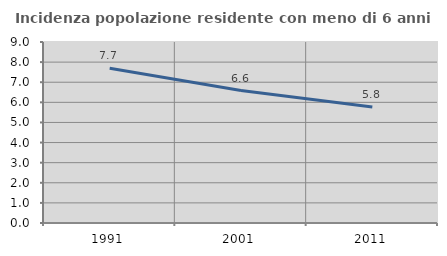
| Category | Incidenza popolazione residente con meno di 6 anni |
|---|---|
| 1991.0 | 7.694 |
| 2001.0 | 6.588 |
| 2011.0 | 5.766 |